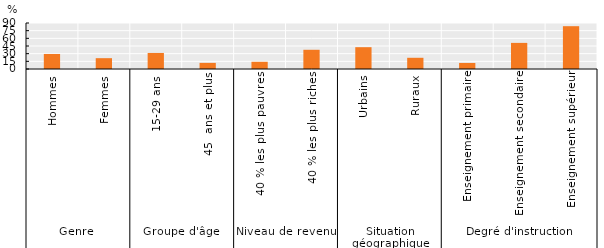
| Category | Series 0 |
|---|---|
| 0 | 29.416 |
| 1 | 21.179 |
| 2 | 31.384 |
| 3 | 11.956 |
| 4 | 14.121 |
| 5 | 37.607 |
| 6 | 42.681 |
| 7 | 21.94 |
| 8 | 11.819 |
| 9 | 51.081 |
| 10 | 83.758 |